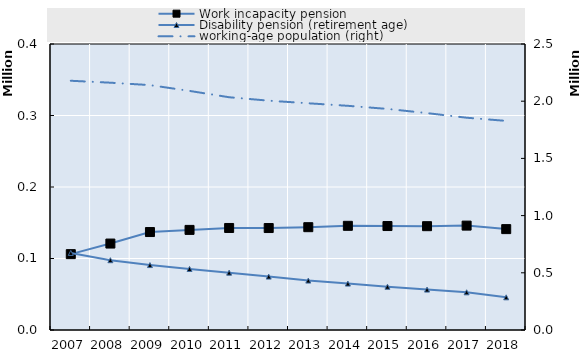
| Category | Work incapacity pension | Disability pension (retirement age) |
|---|---|---|
| 2007.0 | 106100 | 107800 |
| 2008.0 | 120900 | 97600 |
| 2009.0 | 137000 | 90800 |
| 2010.0 | 140000 | 85400 |
| 2011.0 | 142700 | 80200 |
| 2012.0 | 142600 | 74700 |
| 2013.0 | 143800 | 69100 |
| 2014.0 | 145700 | 64900 |
| 2015.0 | 145400 | 60500 |
| 2016.0 | 145200 | 56500 |
| 2017.0 | 146000 | 52700 |
| 2018.0 | 141100 | 45700 |